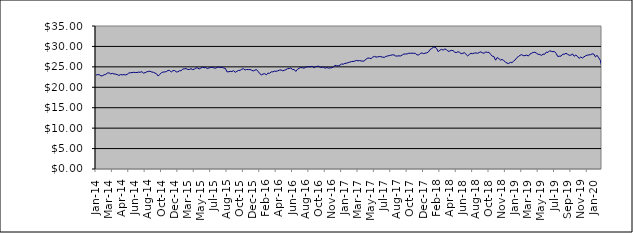
| Category | Series 0 |
|---|---|
| 2014-01-09 | 22.999 |
| 2014-01-17 | 23.1 |
| 2014-01-23 | 23.085 |
| 2014-01-31 | 22.784 |
| 2014-02-10 | 22.84 |
| 2014-02-14 | 23.068 |
| 2014-02-20 | 23.171 |
| 2014-02-28 | 23.482 |
| 2014-03-10 | 23.534 |
| 2014-03-14 | 23.277 |
| 2014-03-20 | 23.406 |
| 2014-03-26 | 23.267 |
| 2014-03-31 | 23.225 |
| 2014-04-09 | 23.097 |
| 2014-04-15 | 22.904 |
| 2014-04-24 | 23.113 |
| 2014-04-30 | 23.041 |
| 2014-05-08 | 23.105 |
| 2014-05-16 | 23.034 |
| 2014-05-22 | 23.146 |
| 2014-05-31 | 23.482 |
| 2014-06-09 | 23.567 |
| 2014-06-16 | 23.577 |
| 2014-06-20 | 23.669 |
| 2014-06-30 | 23.615 |
| 2014-07-09 | 23.619 |
| 2014-07-15 | 23.706 |
| 2014-07-22 | 23.681 |
| 2014-07-31 | 23.825 |
| 2014-08-11 | 23.472 |
| 2014-08-14 | 23.577 |
| 2014-08-21 | 23.783 |
| 2014-08-30 | 23.883 |
| 2014-09-08 | 23.931 |
| 2014-09-16 | 23.747 |
| 2014-09-23 | 23.671 |
| 2014-09-30 | 23.49 |
| 2014-10-09 | 23.29 |
| 2014-10-16 | 22.747 |
| 2014-10-23 | 23.169 |
| 2014-10-31 | 23.58 |
| 2014-11-10 | 23.73 |
| 2014-11-13 | 23.752 |
| 2014-11-20 | 23.855 |
| 2014-11-29 | 24.131 |
| 2014-12-10 | 24.125 |
| 2014-12-18 | 23.728 |
| 2014-12-23 | 24.07 |
| 2014-12-30 | 24.119 |
| 2015-01-08 | 23.768 |
| 2015-01-15 | 23.79 |
| 2015-01-30 | 24.056 |
| 2015-02-10 | 24.058 |
| 2015-02-16 | 24.456 |
| 2015-02-19 | 24.521 |
| 2015-02-28 | 24.571 |
| 2015-03-10 | 24.371 |
| 2015-03-13 | 24.346 |
| 2015-03-19 | 24.569 |
| 2015-03-27 | 24.323 |
| 2015-04-07 | 24.429 |
| 2015-04-16 | 24.73 |
| 2015-04-27 | 24.738 |
| 2015-05-08 | 24.485 |
| 2015-05-14 | 24.7 |
| 2015-05-21 | 24.921 |
| 2015-05-27 | 24.797 |
| 2015-06-03 | 24.844 |
| 2015-06-09 | 24.585 |
| 2015-06-15 | 24.737 |
| 2015-06-22 | 24.853 |
| 2015-06-26 | 24.887 |
| 2015-07-02 | 24.754 |
| 2015-07-09 | 24.666 |
| 2015-07-14 | 24.886 |
| 2015-07-23 | 24.94 |
| 2015-07-29 | 24.849 |
| 2015-08-06 | 24.898 |
| 2015-08-13 | 24.718 |
| 2015-08-20 | 24.62 |
| 2015-08-27 | 23.774 |
| 2015-09-03 | 23.802 |
| 2015-09-09 | 23.906 |
| 2015-09-15 | 23.838 |
| 2015-09-21 | 24.087 |
| 2015-09-28 | 23.655 |
| 2015-10-07 | 23.907 |
| 2015-10-13 | 24.117 |
| 2015-10-22 | 24.15 |
| 2015-10-28 | 24.418 |
| 2015-11-04 | 24.562 |
| 2015-11-13 | 24.213 |
| 2015-11-19 | 24.38 |
| 2015-11-27 | 24.312 |
| 2015-12-03 | 24.366 |
| 2015-12-10 | 24.187 |
| 2015-12-15 | 23.991 |
| 2015-12-23 | 24.19 |
| 2015-12-29 | 24.324 |
| 2016-01-07 | 23.854 |
| 2016-01-14 | 23.338 |
| 2016-01-21 | 23.04 |
| 2016-01-28 | 23.237 |
| 2016-02-04 | 23.344 |
| 2016-02-11 | 23.038 |
| 2016-02-18 | 23.478 |
| 2016-02-25 | 23.416 |
| 2016-03-03 | 23.772 |
| 2016-03-10 | 23.779 |
| 2016-03-16 | 23.946 |
| 2016-03-29 | 23.906 |
| 2016-04-07 | 24.022 |
| 2016-04-14 | 24.196 |
| 2016-04-28 | 24.249 |
| 2016-05-05 | 24.037 |
| 2016-05-12 | 24.156 |
| 2016-05-19 | 24.314 |
| 2016-05-30 | 24.571 |
| 2016-06-03 | 24.598 |
| 2016-06-09 | 24.745 |
| 2016-06-15 | 24.307 |
| 2016-06-23 | 24.373 |
| 2016-06-29 | 23.888 |
| 2016-07-11 | 24.389 |
| 2016-07-14 | 24.65 |
| 2016-07-21 | 24.838 |
| 2016-07-28 | 24.793 |
| 2016-08-04 | 24.674 |
| 2016-08-11 | 24.885 |
| 2016-08-16 | 25.012 |
| 2016-08-24 | 25.046 |
| 2016-08-30 | 25.001 |
| 2016-09-08 | 25.165 |
| 2016-09-15 | 24.77 |
| 2016-09-22 | 25.014 |
| 2016-09-29 | 25.117 |
| 2016-10-06 | 25.148 |
| 2016-10-13 | 24.846 |
| 2016-10-20 | 24.95 |
| 2016-10-28 | 24.876 |
| 2016-11-03 | 24.686 |
| 2016-11-10 | 24.843 |
| 2016-11-15 | 24.688 |
| 2016-11-23 | 24.762 |
| 2016-11-29 | 24.776 |
| 2016-12-07 | 25.004 |
| 2016-12-14 | 25.36 |
| 2016-12-21 | 25.266 |
| 2016-12-28 | 25.238 |
| 2017-01-05 | 25.418 |
| 2017-01-16 | 25.71 |
| 2017-01-23 | 25.647 |
| 2017-01-30 | 25.851 |
| 2017-02-06 | 25.895 |
| 2017-02-13 | 26.046 |
| 2017-02-20 | 26.16 |
| 2017-02-27 | 26.294 |
| 2017-03-06 | 26.323 |
| 2017-03-13 | 26.398 |
| 2017-03-20 | 26.581 |
| 2017-03-27 | 26.465 |
| 2017-03-30 | 26.534 |
| 2017-04-10 | 26.445 |
| 2017-04-18 | 26.389 |
| 2017-04-24 | 26.486 |
| 2017-04-28 | 26.936 |
| 2017-05-08 | 27.148 |
| 2017-05-15 | 27.132 |
| 2017-05-22 | 27.016 |
| 2017-05-30 | 27.373 |
| 2017-06-06 | 27.567 |
| 2017-06-12 | 27.4 |
| 2017-06-15 | 27.425 |
| 2017-06-20 | 27.547 |
| 2017-06-29 | 27.479 |
| 2017-07-04 | 27.387 |
| 2017-07-10 | 27.303 |
| 2017-07-14 | 27.551 |
| 2017-07-19 | 27.657 |
| 2017-07-24 | 27.742 |
| 2017-07-28 | 27.837 |
| 2017-08-03 | 27.942 |
| 2017-08-09 | 27.929 |
| 2017-08-14 | 27.647 |
| 2017-08-21 | 27.655 |
| 2017-08-24 | 27.69 |
| 2017-08-30 | 27.674 |
| 2017-09-07 | 27.904 |
| 2017-09-14 | 28.136 |
| 2017-09-20 | 28.142 |
| 2017-09-29 | 28.169 |
| 2017-10-05 | 28.327 |
| 2017-10-11 | 28.327 |
| 2017-10-16 | 28.337 |
| 2017-10-23 | 28.331 |
| 2017-10-30 | 28.296 |
| 2017-11-07 | 27.962 |
| 2017-11-15 | 27.875 |
| 2017-11-23 | 28.279 |
| 2017-11-29 | 28.401 |
| 2017-12-07 | 28.246 |
| 2017-12-13 | 28.349 |
| 2017-12-18 | 28.423 |
| 2017-12-28 | 28.648 |
| 2018-01-08 | 29.23 |
| 2018-01-17 | 29.477 |
| 2018-01-24 | 29.791 |
| 2018-01-30 | 29.816 |
| 2018-02-05 | 29.497 |
| 2018-02-13 | 28.708 |
| 2018-02-19 | 29.08 |
| 2018-02-27 | 29.292 |
| 2018-03-07 | 29.092 |
| 2018-03-14 | 29.388 |
| 2018-03-21 | 29.212 |
| 2018-03-29 | 28.79 |
| 2018-04-10 | 28.873 |
| 2018-04-16 | 29.036 |
| 2018-04-23 | 28.991 |
| 2018-04-27 | 28.624 |
| 2018-05-10 | 28.475 |
| 2018-05-15 | 28.719 |
| 2018-05-22 | 28.534 |
| 2018-05-30 | 28.234 |
| 2018-06-06 | 28.324 |
| 2018-06-13 | 28.456 |
| 2018-06-20 | 28.07 |
| 2018-06-29 | 27.684 |
| 2018-07-10 | 28.039 |
| 2018-07-16 | 28.331 |
| 2018-07-23 | 28.224 |
| 2018-07-30 | 28.369 |
| 2018-08-07 | 28.406 |
| 2018-08-13 | 28.317 |
| 2018-08-24 | 28.516 |
| 2018-08-30 | 28.678 |
| 2018-09-06 | 28.434 |
| 2018-09-13 | 28.336 |
| 2018-09-24 | 28.643 |
| 2018-09-28 | 28.534 |
| 2018-10-04 | 28.564 |
| 2018-10-10 | 28.05 |
| 2018-10-16 | 27.602 |
| 2018-10-23 | 27.546 |
| 2018-10-30 | 26.634 |
| 2018-11-07 | 27.28 |
| 2018-11-15 | 27.026 |
| 2018-11-21 | 26.669 |
| 2018-11-29 | 26.802 |
| 2018-12-07 | 26.544 |
| 2018-12-14 | 26.185 |
| 2018-12-21 | 25.93 |
| 2018-12-28 | 25.809 |
| 2019-01-08 | 26.11 |
| 2019-01-14 | 26.016 |
| 2019-01-21 | 26.394 |
| 2019-01-30 | 26.704 |
| 2019-02-11 | 27.267 |
| 2019-02-14 | 27.53 |
| 2019-02-21 | 27.848 |
| 2019-02-27 | 27.973 |
| 2019-03-07 | 27.746 |
| 2019-03-14 | 27.747 |
| 2019-03-21 | 27.901 |
| 2019-03-29 | 27.641 |
| 2019-04-04 | 28.121 |
| 2019-04-12 | 28.329 |
| 2019-04-18 | 28.52 |
| 2019-04-29 | 28.579 |
| 2019-05-08 | 28.341 |
| 2019-05-15 | 28.05 |
| 2019-05-23 | 28.058 |
| 2019-05-30 | 27.791 |
| 2019-06-10 | 28.119 |
| 2019-06-14 | 28.083 |
| 2019-06-21 | 28.614 |
| 2019-06-28 | 28.528 |
| 2019-07-04 | 28.938 |
| 2019-07-15 | 28.806 |
| 2019-07-22 | 28.726 |
| 2019-07-30 | 28.735 |
| 2019-08-06 | 28.276 |
| 2019-08-16 | 27.533 |
| 2019-08-22 | 27.605 |
| 2019-08-30 | 27.629 |
| 2019-09-09 | 28.093 |
| 2019-09-16 | 28.086 |
| 2019-09-20 | 28.324 |
| 2019-09-27 | 28.068 |
| 2019-10-03 | 27.837 |
| 2019-10-09 | 27.857 |
| 2019-10-15 | 28.156 |
| 2019-10-30 | 27.607 |
| 2019-11-07 | 27.863 |
| 2019-11-14 | 27.585 |
| 2019-11-21 | 27.07 |
| 2019-11-29 | 27.417 |
| 2019-12-05 | 27.154 |
| 2019-12-11 | 27.451 |
| 2019-12-17 | 27.709 |
| 2019-12-23 | 27.863 |
| 2019-12-30 | 27.921 |
| 2020-01-07 | 27.979 |
| 2020-01-15 | 28.174 |
| 2020-01-22 | 28.133 |
| 2020-01-30 | 27.442 |
| 2020-02-06 | 27.828 |
| 2020-02-14 | 27.21 |
| 2020-02-20 | 26.571 |
| 2020-02-28 | 24.758 |